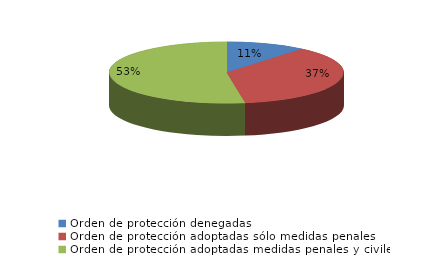
| Category | Series 0 |
|---|---|
| Orden de protección denegadas | 61 |
| Orden de protección adoptadas sólo medidas penales | 203 |
| Orden de protección adoptadas medidas penales y civiles | 292 |